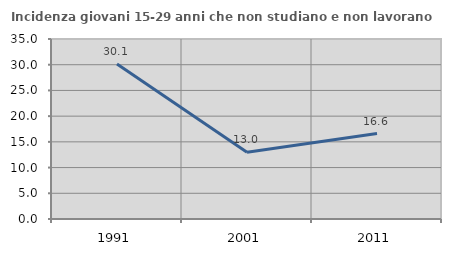
| Category | Incidenza giovani 15-29 anni che non studiano e non lavorano  |
|---|---|
| 1991.0 | 30.137 |
| 2001.0 | 12.98 |
| 2011.0 | 16.611 |